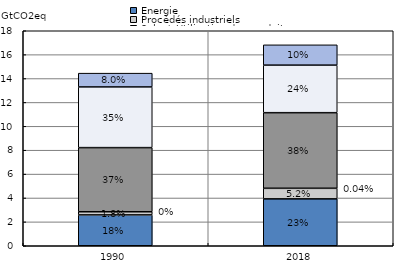
| Category | Énergie | Procédés industriels | Solv + Utilisation des produits | Agriculture | UTCAFT | Déchets |
|---|---|---|---|---|---|---|
| 1990.0 | 2.583 | 0.263 | 0 | 5.37 | 5.08 | 1.155 |
| 2018.0 | 3.927 | 0.881 | 0.007 | 6.326 | 3.982 | 1.699 |